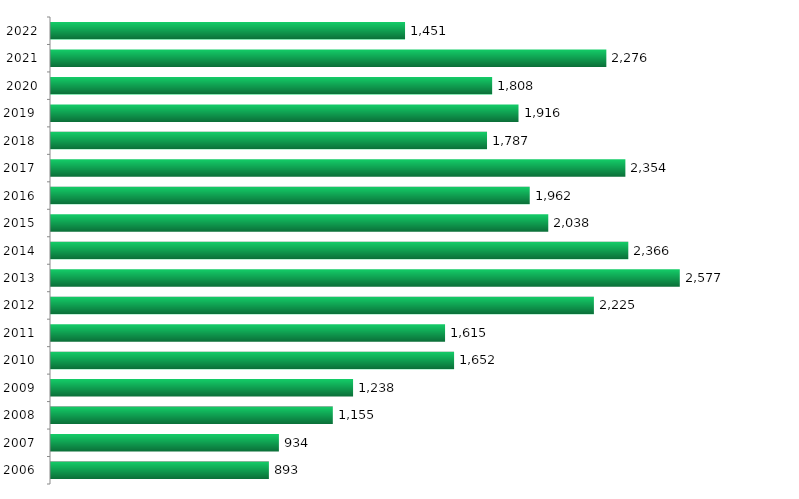
| Category | Ingressantes |
|---|---|
| 2006.0 | 893 |
| 2007.0 | 934 |
| 2008.0 | 1155 |
| 2009.0 | 1238 |
| 2010.0 | 1652 |
| 2011.0 | 1615 |
| 2012.0 | 2225 |
| 2013.0 | 2577 |
| 2014.0 | 2366 |
| 2015.0 | 2038 |
| 2016.0 | 1962 |
| 2017.0 | 2354 |
| 2018.0 | 1787 |
| 2019.0 | 1916 |
| 2020.0 | 1808 |
| 2021.0 | 2276 |
| 2022.0 | 1451 |